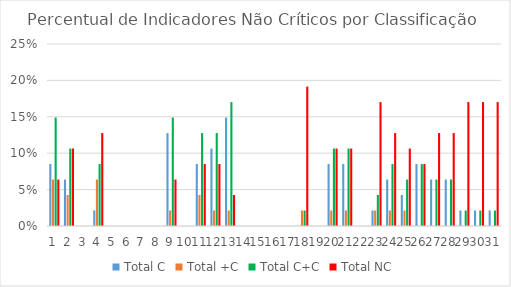
| Category | Total C | Total +C | Total C+C | Total NC |
|---|---|---|---|---|
| 0 | 0.085 | 0.064 | 0.149 | 0.064 |
| 1 | 0.064 | 0.043 | 0.106 | 0.106 |
| 2 | 0 | 0 | 0 | 0 |
| 3 | 0.021 | 0.064 | 0.085 | 0.128 |
| 4 | 0 | 0 | 0 | 0 |
| 5 | 0 | 0 | 0 | 0 |
| 6 | 0 | 0 | 0 | 0 |
| 7 | 0 | 0 | 0 | 0 |
| 8 | 0.128 | 0.021 | 0.149 | 0.064 |
| 9 | 0 | 0 | 0 | 0 |
| 10 | 0.085 | 0.043 | 0.128 | 0.085 |
| 11 | 0.106 | 0.021 | 0.128 | 0.085 |
| 12 | 0.149 | 0.021 | 0.17 | 0.043 |
| 13 | 0 | 0 | 0 | 0 |
| 14 | 0 | 0 | 0 | 0 |
| 15 | 0 | 0 | 0 | 0 |
| 16 | 0 | 0 | 0 | 0 |
| 17 | 0 | 0.021 | 0.021 | 0.191 |
| 18 | 0 | 0 | 0 | 0 |
| 19 | 0.085 | 0.021 | 0.106 | 0.106 |
| 20 | 0.085 | 0.021 | 0.106 | 0.106 |
| 21 | 0 | 0 | 0 | 0 |
| 22 | 0.021 | 0.021 | 0.043 | 0.17 |
| 23 | 0.064 | 0.021 | 0.085 | 0.128 |
| 24 | 0.043 | 0.021 | 0.064 | 0.106 |
| 25 | 0.085 | 0 | 0.085 | 0.085 |
| 26 | 0.064 | 0 | 0.064 | 0.128 |
| 27 | 0.064 | 0 | 0.064 | 0.128 |
| 28 | 0.021 | 0 | 0.021 | 0.17 |
| 29 | 0.021 | 0 | 0.021 | 0.17 |
| 30 | 0.021 | 0 | 0.021 | 0.17 |